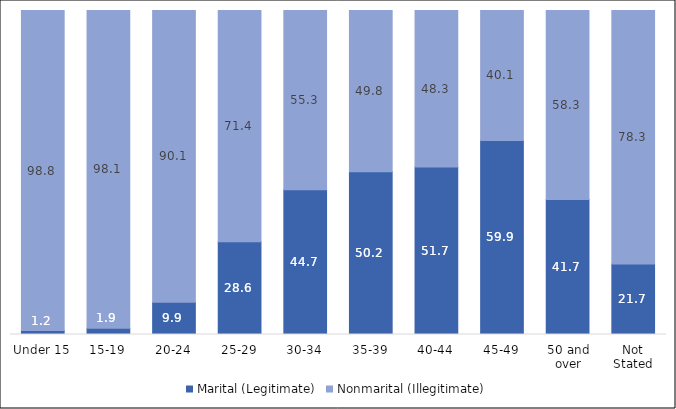
| Category | Marital (Legitimate) | Nonmarital (Illegitimate) |
|---|---|---|
| Under 15 | 1.231 | 98.769 |
| 15-19 | 1.94 | 98.06 |
| 20-24 | 9.919 | 90.081 |
| 25-29 | 28.644 | 71.356 |
| 30-34 | 44.675 | 55.325 |
| 35-39 | 50.219 | 49.781 |
| 40-44 | 51.722 | 48.278 |
| 45-49 | 59.89 | 40.11 |
| 50 and over | 41.667 | 58.333 |
| Not Stated | 21.739 | 78.261 |